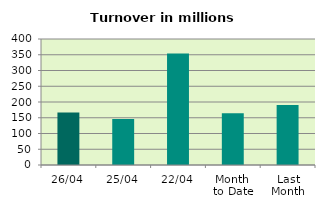
| Category | Series 0 |
|---|---|
| 26/04 | 166.9 |
| 25/04 | 146.057 |
| 22/04 | 354.167 |
| Month 
to Date | 163.961 |
| Last
Month | 190.797 |